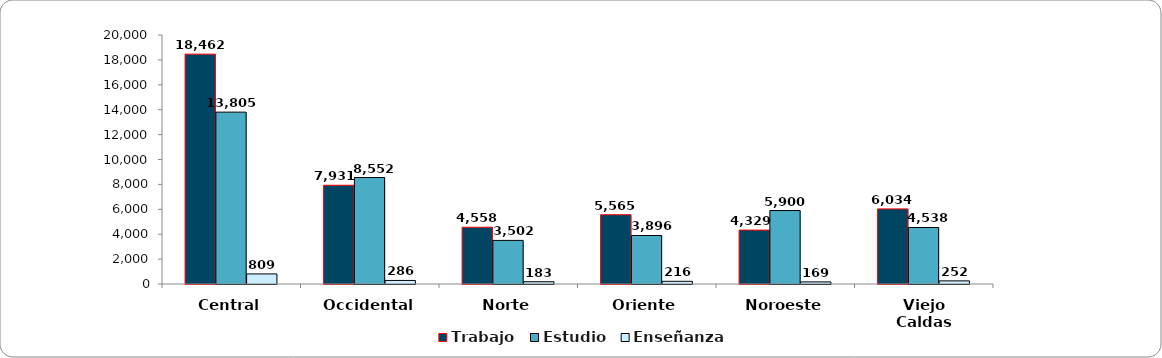
| Category | Trabajo | Estudio | Enseñanza |
|---|---|---|---|
| Central | 18462 | 13805 | 809 |
| Occidental | 7931 | 8552 | 286 |
| Norte | 4558 | 3502 | 183 |
| Oriente | 5565 | 3896 | 216 |
| Noroeste | 4329 | 5900 | 169 |
| Viejo Caldas | 6034 | 4538 | 252 |